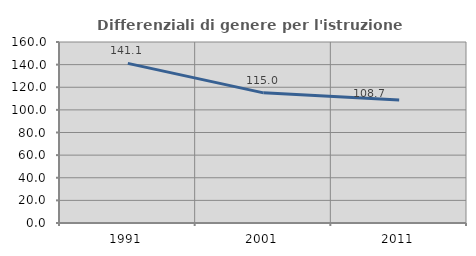
| Category | Differenziali di genere per l'istruzione superiore |
|---|---|
| 1991.0 | 141.116 |
| 2001.0 | 115.038 |
| 2011.0 | 108.685 |